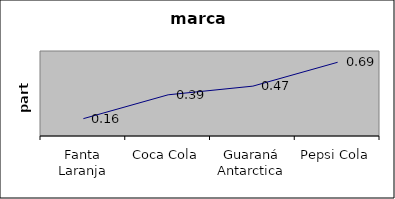
| Category | Series 0 |
|---|---|
| Fanta Laranja | 0.163 |
| Coca Cola | 0.388 |
| Guaraná Antarctica | 0.469 |
| Pepsi Cola | 0.694 |